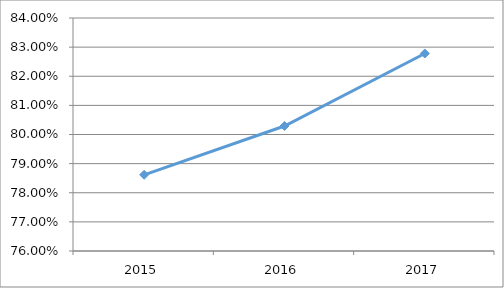
| Category | FENT-F3O29 |
|---|---|
| 2015.0 | 0.786 |
| 2016.0 | 0.803 |
| 2017.0 | 0.828 |